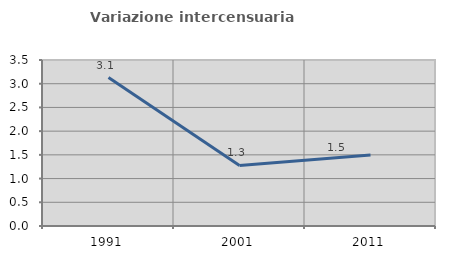
| Category | Variazione intercensuaria annua |
|---|---|
| 1991.0 | 3.13 |
| 2001.0 | 1.277 |
| 2011.0 | 1.497 |